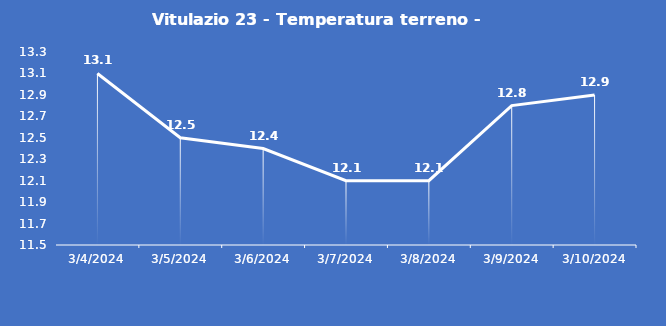
| Category | Vitulazio 23 - Temperatura terreno - Grezzo (°C) |
|---|---|
| 3/4/24 | 13.1 |
| 3/5/24 | 12.5 |
| 3/6/24 | 12.4 |
| 3/7/24 | 12.1 |
| 3/8/24 | 12.1 |
| 3/9/24 | 12.8 |
| 3/10/24 | 12.9 |